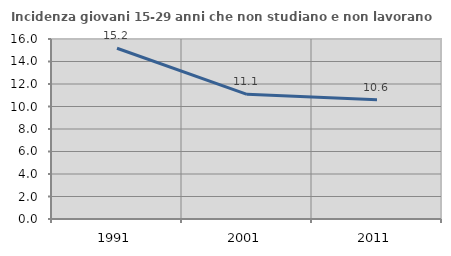
| Category | Incidenza giovani 15-29 anni che non studiano e non lavorano  |
|---|---|
| 1991.0 | 15.175 |
| 2001.0 | 11.084 |
| 2011.0 | 10.608 |